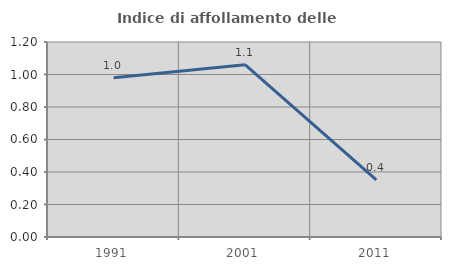
| Category | Indice di affollamento delle abitazioni  |
|---|---|
| 1991.0 | 0.98 |
| 2001.0 | 1.06 |
| 2011.0 | 0.352 |